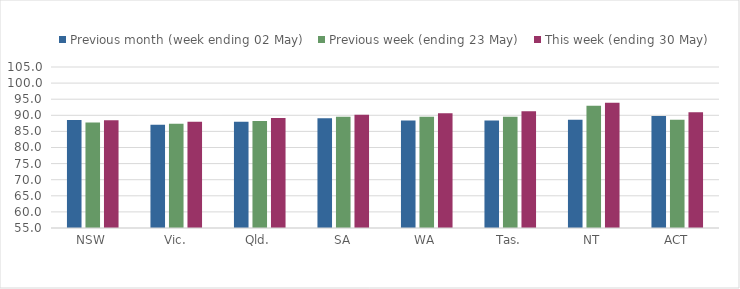
| Category | Previous month (week ending 02 May) | Previous week (ending 23 May) | This week (ending 30 May) |
|---|---|---|---|
| NSW | 88.503 | 87.775 | 88.449 |
| Vic. | 87.045 | 87.4 | 87.961 |
| Qld. | 87.966 | 88.251 | 89.132 |
| SA | 89.081 | 89.528 | 90.18 |
| WA | 88.353 | 89.542 | 90.637 |
| Tas. | 88.364 | 89.576 | 91.244 |
| NT | 88.61 | 92.938 | 93.868 |
| ACT | 89.811 | 88.596 | 90.919 |